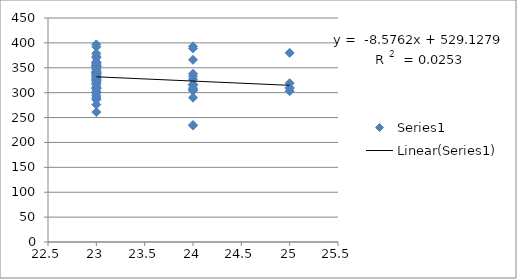
| Category | Series 0 |
|---|---|
| 23.0 | 349 |
| 23.0 | 309 |
| 23.0 | 309 |
| 23.0 | 326 |
| 23.0 | 333 |
| 23.0 | 336 |
| 23.0 | 343 |
| 23.0 | 327 |
| 23.0 | 354 |
| 23.0 | 354 |
| 23.0 | 361 |
| 23.0 | 316 |
| 23.0 | 327 |
| 23.0 | 339 |
| 23.0 | 346 |
| 23.0 | 361 |
| 23.0 | 356 |
| 23.0 | 294 |
| 23.0 | 324 |
| 24.0 | 333 |
| 23.0 | 329 |
| 23.0 | 276 |
| 23.0 | 341 |
| 23.0 | 324 |
| 23.0 | 309 |
| 23.0 | 311 |
| 23.0 | 261 |
| 23.0 | 379 |
| 23.0 | 321 |
| 23.0 | 341 |
| 23.0 | 359 |
| 23.0 | 291 |
| 23.0 | 352 |
| 23.0 | 286 |
| 24.0 | 317 |
| 24.0 | 307 |
| 24.0 | 327 |
| 24.0 | 389 |
| 24.0 | 393 |
| 24.0 | 366 |
| 23.0 | 339 |
| 23.0 | 373 |
| 23.0 | 337 |
| 23.0 | 352 |
| 23.0 | 370 |
| 23.0 | 352 |
| 23.0 | 334 |
| 23.0 | 299 |
| 23.0 | 397 |
| 23.0 | 392 |
| 24.0 | 305 |
| 24.0 | 309 |
| 24.0 | 235 |
| 24.0 | 234 |
| 24.0 | 338 |
| 24.0 | 304 |
| 24.0 | 315 |
| 24.0 | 316 |
| 25.0 | 309 |
| 25.0 | 310 |
| 23.0 | 342 |
| 23.0 | 351 |
| 23.0 | 287 |
| 23.0 | 311 |
| 23.0 | 362 |
| 23.0 | 355 |
| 23.0 | 352 |
| 23.0 | 303 |
| 23.0 | 330 |
| 23.0 | 301 |
| 23.0 | 308 |
| 24.0 | 290 |
| 23.0 | 340 |
| 23.0 | 332 |
| 23.0 | 321 |
| 23.0 | 319 |
| 23.0 | 325 |
| 25.0 | 319 |
| 25.0 | 380 |
| 25.0 | 303 |